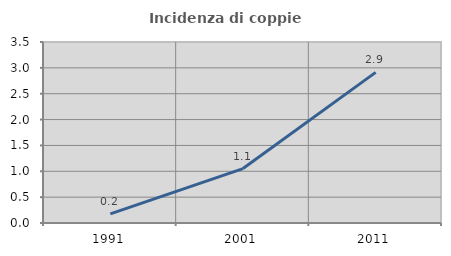
| Category | Incidenza di coppie miste |
|---|---|
| 1991.0 | 0.177 |
| 2001.0 | 1.053 |
| 2011.0 | 2.913 |